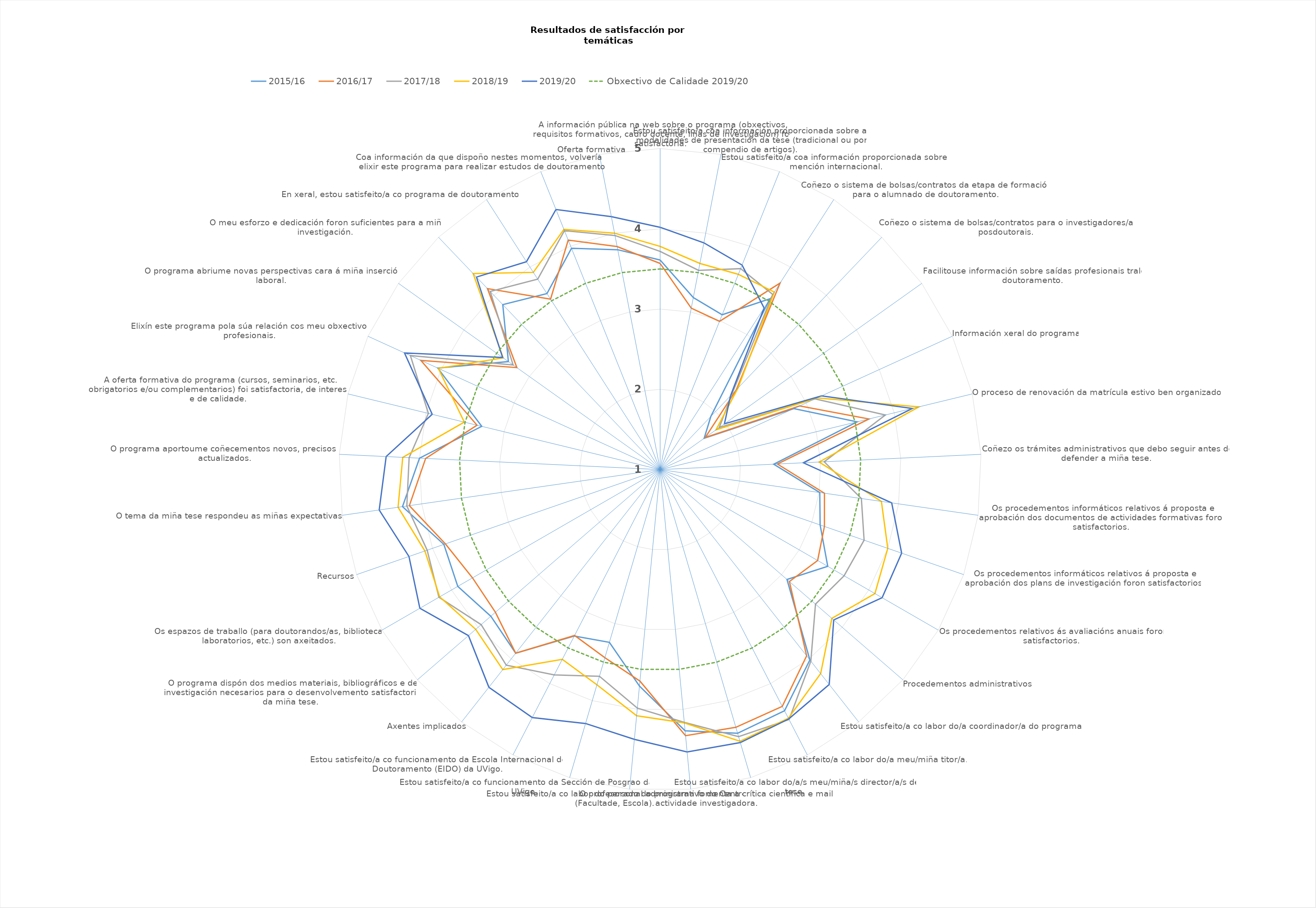
| Category | 2015/16 | 2016/17 | 2017/18 | 2018/19 | 2019/20 | Obxectivo de Calidade 2019/20 |
|---|---|---|---|---|---|---|
| A información pública na web sobre o programa (obxectivos, requisitos formativos, cadro docente, liñas de investigación) foi satisfactoria. | 3.612 | 3.569 | 3.718 | 3.781 | 4.019 | 3.5 |
| Estou satisfeito/a coa información proporcionada sobre as modalidades de presentación da tese (tradicional ou por compendio de artigos). | 3.183 | 3.049 | 3.528 | 3.616 | 3.877 | 3.5 |
| Estou satisfeito/a coa información proporcionada sobre a mención internacional. | 3.078 | 2.99 | 3.697 | 3.62 | 3.745 | 3.5 |
| Coñezo o sistema de bolsas/contratos da etapa de formación para o alumnado de doutoramento. | 3.53 | 3.763 | 3.594 | 3.63 | 3.394 | 3.5 |
| Coñezo o sistema de bolsas/contratos para o investigadores/as posdoutorais. | 1.915 | 2.375 | 2.291 | 2.405 | 2.27 | 3.5 |
| Facilitouse información sobre saídas profesionais tralo doutoramento. | 1.673 | 1.69 | 1.904 | 1.854 | 1.983 | 3.5 |
| Información xeral do programa | 2.83 | 2.91 | 3.12 | 3.15 | 3.21 | 3.5 |
| O proceso de renovación da matrícula estivo ben organizado. | 3.525 | 3.676 | 3.887 | 4.316 | 4.231 | 3.5 |
| Coñezo os trámites administrativos que debo seguir antes de defender a miña tese. | 2.416 | 2.462 | 3.046 | 2.982 | 2.785 | 3.5 |
| Os procedementos informáticos relativos á proposta e aprobación dos documentos de actividades formativas foron satisfactorios. | 3.008 | 3.067 | 3.532 | 3.784 | 3.913 | 3.5 |
| Os procedementos informáticos relativos á proposta e aprobación dos plans de investigación foron satisfactorios. | 3.108 | 3.165 | 3.688 | 4 | 4.183 | 3.5 |
| Os procedementos relativos ás avaliacións anuais foron satisfactorios. | 3.41 | 3.265 | 3.645 | 4.088 | 4.192 | 3.5 |
| Procedementos administrativos | 3.09 | 3.13 | 3.56 | 3.83 | 3.86 | 3.5 |
| Estou satisfeito/a co labor do/a coordinador/a do programa. | 4.017 | 3.951 | 4.036 | 4.234 | 4.406 | 3.5 |
| Estou satisfeito/a co labor do/a meu/miña titor/a. | 4.381 | 4.319 | 4.504 | 4.485 | 4.495 | 3.5 |
| Estou satisfeito/a co labor do/a/s meu/miña/s director/a/s de tese. | 4.424 | 4.346 | 4.468 | 4.528 | 4.545 | 3.5 |
| O profesorado do programa fomenta a crítica científica e maila actividade investigadora. | 4.269 | 4.33 | 4.164 | 4.17 | 4.534 | 3.5 |
| Estou satisfeito/a co labor do personal administrativo do Centro (Facultade, Escola). | 3.709 | 3.647 | 3.986 | 4.08 | 4.376 | 3.5 |
| Estou satisfeito/a co funcionamento da Sección de Posgrao da UVigo. | 3.243 | 3.442 | 3.683 | 3.794 | 4.297 | 3.5 |
| Estou satisfeito/a co funcionamento da Escola Internacional de Doutoramento (EIDO) da UVigo. | 3.333 | 3.325 | 3.878 | 3.659 | 4.475 | 3.5 |
| Axentes implicados | 3.91 | 3.91 | 4.1 | 4.17 | 4.45 | 3.5 |
| O programa dispón dos medios materiais, bibliográficos e de investigación necesarios para o desenvolvemento satisfactorio da miña tese. | 3.79 | 3.714 | 3.95 | 4.039 | 4.158 | 3.5 |
| Os espazos de traballo (para doutorandos/as, biblioteca, laboratorios, etc.) son axeitados. | 3.91 | 3.698 | 4.181 | 4.17 | 4.455 | 3.5 |
| Recursos | 3.85 | 3.83 | 4.07 | 4.1 | 4.31 | 3.5 |
| O tema da miña tese respondeu as miñas expectativas. | 4.241 | 4.155 | 4.187 | 4.297 | 4.535 | 3.5 |
| O programa aportoume coñecementos novos, precisos e actualizados. | 4 | 3.924 | 4.129 | 4.209 | 4.416 | 3.5 |
| A oferta formativa do programa (cursos, seminarios, etc. obrigatorios e/ou complementarios) foi satisfactoria, de interese e de calidade. | 3.286 | 3.347 | 3.97 | 3.509 | 3.921 | 3.5 |
| Elixín este programa pola súa relación cos meu obxectivos profesionais. | 4.044 | 4.277 | 4.419 | 4.037 | 4.5 | 3.5 |
| O programa abriume novas perspectivas cara á miña inserción laboral. | 3.32 | 3.19 | 3.248 | 3.4 | 3.408 | 3.5 |
| O meu esforzo e dedicación foron suficientes para a miña investigación. | 3.84 | 4.116 | 4.067 | 4.375 | 4.314 | 3.5 |
| En xeral, estou satisfeito/a co programa de doutoramento. | 3.607 | 3.524 | 3.82 | 3.921 | 4.079 | 3.5 |
| Coa información da que dispoño nestes momentos, volvería a elixir este programa para realizar estudos de doutoramento. | 3.97 | 4.08 | 4.207 | 4.224 | 4.491 | 3.5 |
|  Oferta formativa | 3.79 | 3.83 | 3.97 | 4 | 4.21 | 3.5 |